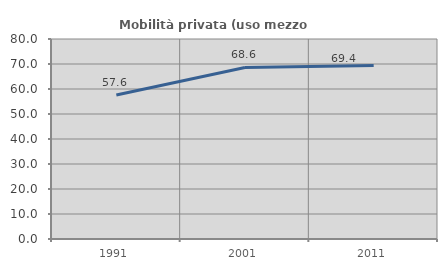
| Category | Mobilità privata (uso mezzo privato) |
|---|---|
| 1991.0 | 57.58 |
| 2001.0 | 68.604 |
| 2011.0 | 69.439 |